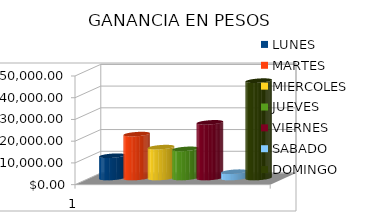
| Category | LUNES | MARTES | MIERCOLES | JUEVES  | VIERNES  | SABADO | DOMINGO |
|---|---|---|---|---|---|---|---|
| 0 | 10250 | 20200 | 14200 | 13400 | 25600 | 2900 | 44800 |